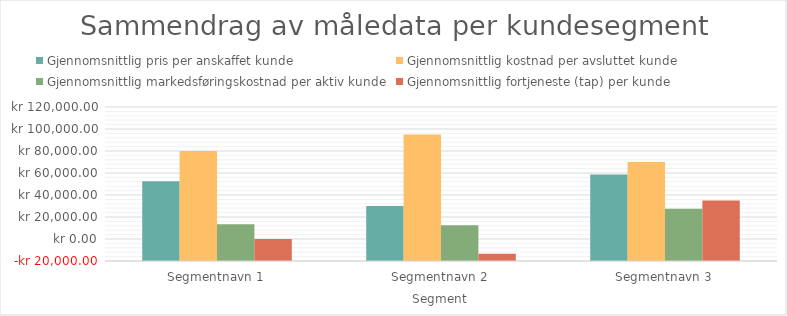
| Category | Gjennomsnittlig pris per anskaffet kunde | Gjennomsnittlig kostnad per avsluttet kunde | Gjennomsnittlig markedsføringskostnad per aktiv kunde | Gjennomsnittlig fortjeneste (tap) per kunde |
|---|---|---|---|---|
| Segmentnavn 1 | 52500 | 80000 | 13333.333 | 0 |
| Segmentnavn 2 | 30000 | 95000 | 12500 | -13500 |
| Segmentnavn 3 | 58750 | 70000 | 27500 | 35000 |